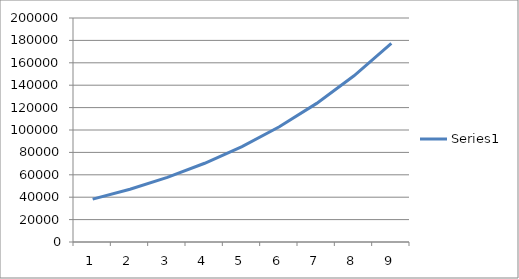
| Category | Series 0 |
|---|---|
| 0 | 38251.489 |
| 1 | 47135.979 |
| 2 | 57719.403 |
| 3 | 70298.243 |
| 4 | 85218.039 |
| 5 | 102881.221 |
| 6 | 123756.171 |
| 7 | 148387.693 |
| 8 | 177409.106 |